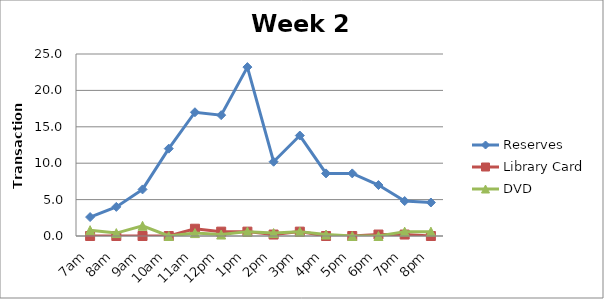
| Category | Reserves | Library Card | DVD |
|---|---|---|---|
| 7am | 2.6 | 0 | 0.8 |
| 8am | 4 | 0 | 0.4 |
| 9am | 6.4 | 0 | 1.4 |
| 10am | 12 | 0 | 0 |
| 11am | 17 | 1 | 0.4 |
| 12pm | 16.6 | 0.6 | 0.2 |
| 1pm | 23.2 | 0.6 | 0.6 |
| 2pm | 10.2 | 0.2 | 0.4 |
| 3pm | 13.8 | 0.6 | 0.6 |
| 4pm | 8.6 | 0 | 0.2 |
| 5pm | 8.6 | 0 | 0 |
| 6pm | 7 | 0.2 | 0 |
| 7pm | 4.8 | 0.2 | 0.6 |
| 8pm | 4.6 | 0 | 0.6 |